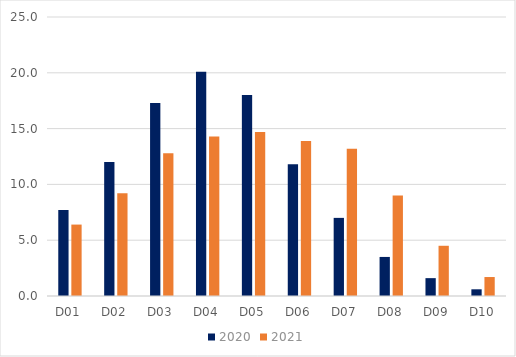
| Category | 2020 | 2021 |
|---|---|---|
| D01 | 7.7 | 6.4 |
| D02 | 12 | 9.2 |
| D03 | 17.3 | 12.8 |
| D04 | 20.1 | 14.3 |
| D05 | 18 | 14.7 |
| D06 | 11.8 | 13.9 |
| D07 | 7 | 13.2 |
| D08 | 3.5 | 9 |
| D09 | 1.6 | 4.5 |
| D10 | 0.6 | 1.7 |